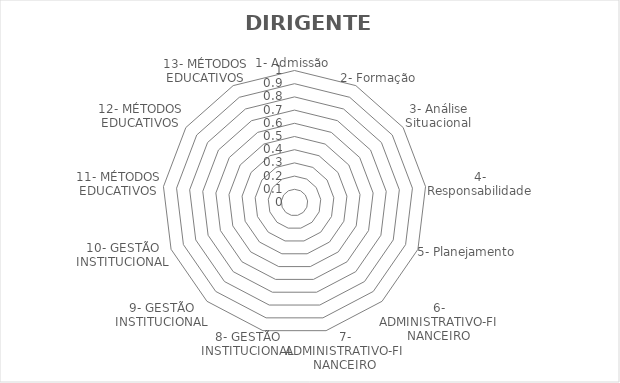
| Category | Respostas |
|---|---|
| 1- Admissão | 0 |
| 2- Formação | 0 |
| 3- Análise Situacional | 0 |
| 4- Responsabilidade | 0 |
| 5- Planejamento | 0 |
| 6- ADMINISTRATIVO-FINANCEIRO | 0 |
| 7- ADMINISTRATIVO-FINANCEIRO | 0 |
| 8- GESTÃO INSTITUCIONAL | 0 |
| 9- GESTÃO INSTITUCIONAL | 0 |
| 10- GESTÃO INSTITUCIONAL | 0 |
| 11- MÉTODOS EDUCATIVOS | 0 |
| 12- MÉTODOS EDUCATIVOS | 0 |
| 13- MÉTODOS EDUCATIVOS | 0 |